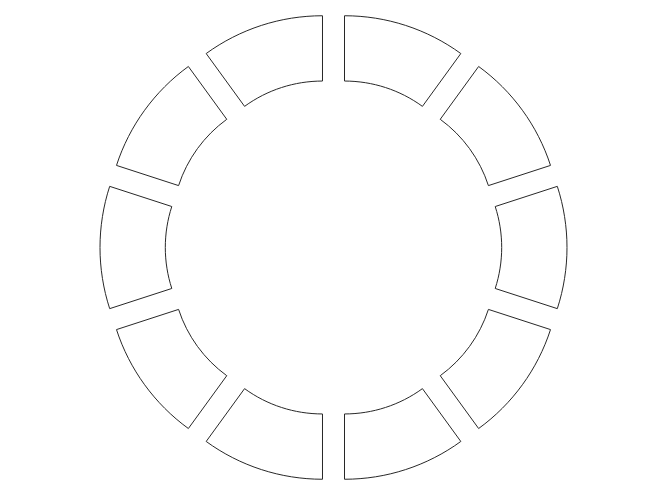
| Category | Series 0 |
|---|---|
| 0 | 0 |
| 1 | 0 |
| 2 | 0 |
| 3 | 0 |
| 4 | 0 |
| 5 | 1 |
| 6 | 0 |
| 7 | 0 |
| 8 | 0 |
| 9 | 0 |
| 10 | 0 |
| 11 | 1 |
| 12 | 0 |
| 13 | 0 |
| 14 | 0 |
| 15 | 0 |
| 16 | 0 |
| 17 | 1 |
| 18 | 0 |
| 19 | 0 |
| 20 | 0 |
| 21 | 0 |
| 22 | 0 |
| 23 | 1 |
| 24 | 0 |
| 25 | 0 |
| 26 | 0 |
| 27 | 0 |
| 28 | 0 |
| 29 | 1 |
| 30 | 0 |
| 31 | 0 |
| 32 | 0 |
| 33 | 0 |
| 34 | 0 |
| 35 | 1 |
| 36 | 0 |
| 37 | 0 |
| 38 | 0 |
| 39 | 0 |
| 40 | 0 |
| 41 | 1 |
| 42 | 0 |
| 43 | 0 |
| 44 | 0 |
| 45 | 0 |
| 46 | 0 |
| 47 | 1 |
| 48 | 0 |
| 49 | 0 |
| 50 | 0 |
| 51 | 0 |
| 52 | 0 |
| 53 | 1 |
| 54 | 0 |
| 55 | 0 |
| 56 | 0 |
| 57 | 0 |
| 58 | 0 |
| 59 | 1 |